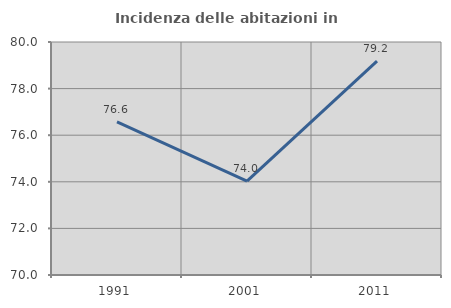
| Category | Incidenza delle abitazioni in proprietà  |
|---|---|
| 1991.0 | 76.571 |
| 2001.0 | 74.026 |
| 2011.0 | 79.175 |